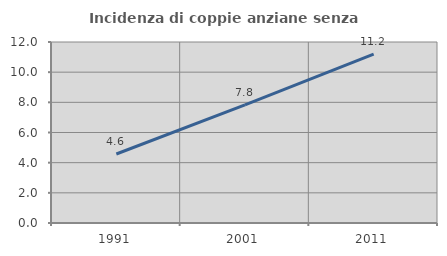
| Category | Incidenza di coppie anziane senza figli  |
|---|---|
| 1991.0 | 4.574 |
| 2001.0 | 7.831 |
| 2011.0 | 11.19 |